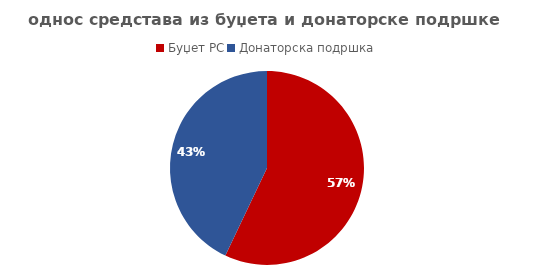
| Category | Series 0 |
|---|---|
| Буџет РС | 1138956.258 |
| Донаторска подршка | 857114.461 |